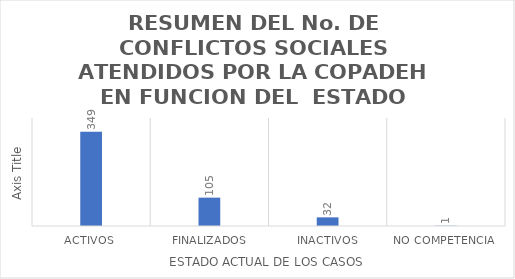
| Category | RESUMEN BASE DE DATOS COPADEH |
|---|---|
| ACTIVOS  | 349 |
| FINALIZADOS | 105 |
| INACTIVOS | 32 |
| NO COMPETENCIA  | 1 |